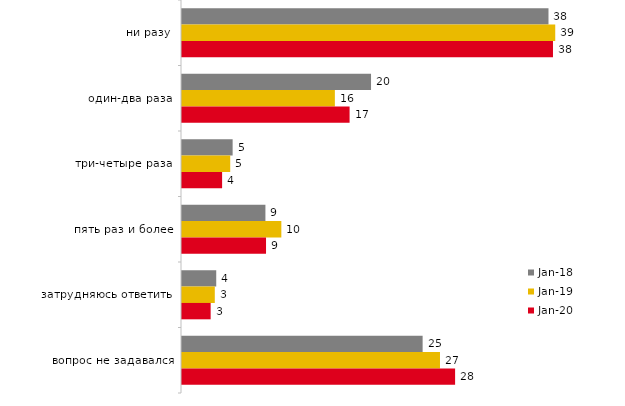
| Category | янв.18 | янв.19 | янв.20 |
|---|---|---|---|
| ни разу | 38 | 38.7 | 38.465 |
| один-два раза | 19.6 | 15.85 | 17.376 |
| три-четыре раза | 5.25 | 5 | 4.158 |
| пять раз и более | 8.65 | 10.3 | 8.713 |
| затрудняюсь ответить | 3.55 | 3.4 | 2.97 |
| вопрос не задавался | 24.95 | 26.75 | 28.317 |